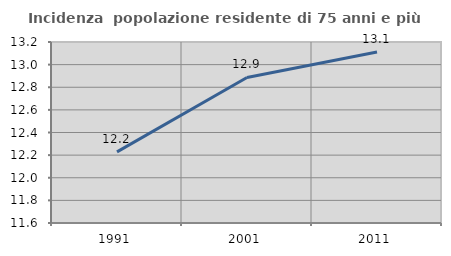
| Category | Incidenza  popolazione residente di 75 anni e più |
|---|---|
| 1991.0 | 12.229 |
| 2001.0 | 12.887 |
| 2011.0 | 13.112 |